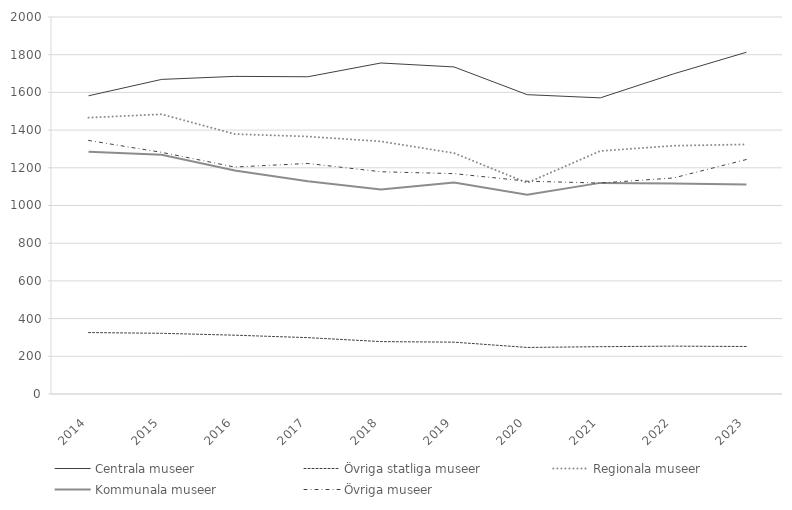
| Category | Centrala museer | Övriga statliga museer | Regionala museer | Kommunala museer | Övriga museer |
|---|---|---|---|---|---|
| 2014 | 1582 | 326 | 1466 | 1285 | 1345 |
| 2015 | 1669 | 322 | 1484 | 1269 | 1282 |
| 2016 | 1685 | 312 | 1379 | 1186 | 1204 |
| 2017 | 1683 | 299 | 1366 | 1129 | 1223 |
| 2018 | 1756 | 278 | 1340 | 1085 | 1179 |
| 2019 | 1735 | 275 | 1278 | 1122 | 1169 |
| 2020 | 1588 | 247 | 1120 | 1057 | 1129 |
| 2021 | 1571 | 251 | 1289 | 1120 | 1119 |
| 2022 | 1698 | 254 | 1317 | 1117 | 1146 |
| 2023 | 1813 | 252 | 1324 | 1112 | 1244 |